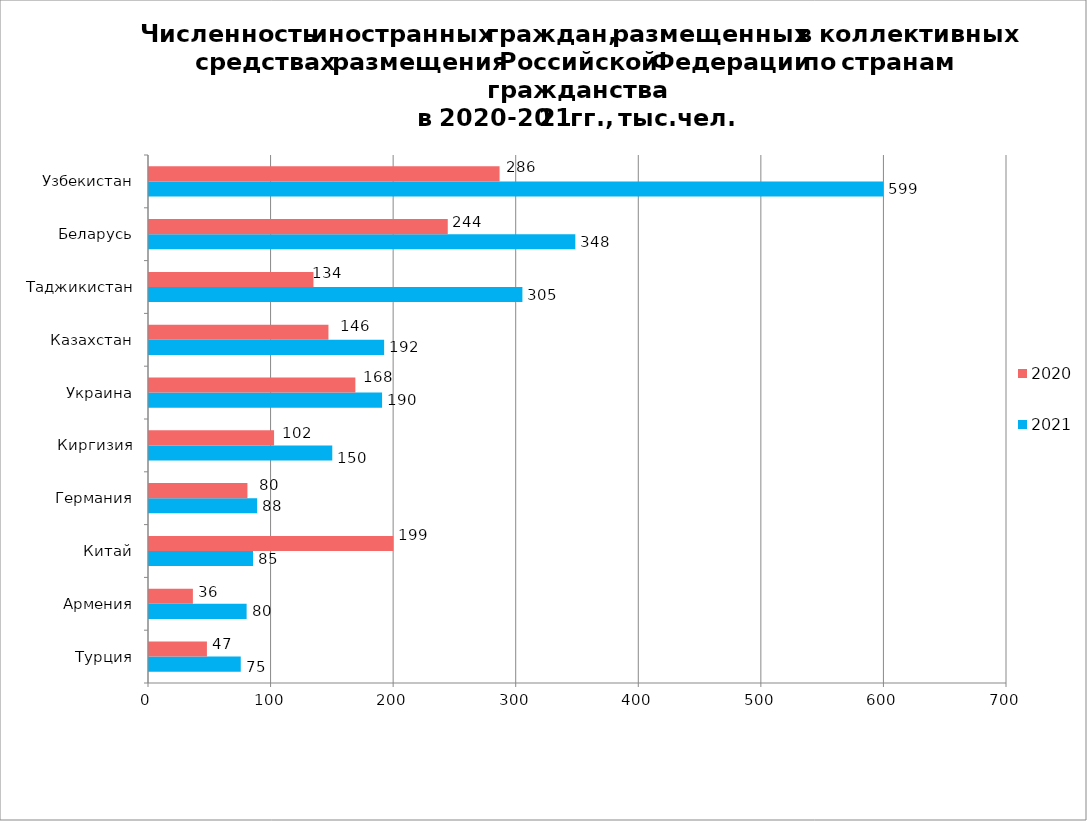
| Category | 2021 | 2020 |
|---|---|---|
| Турция | 74.855 | 47.257 |
| Армения | 79.648 | 35.813 |
| Китай | 84.895 | 199.35 |
| Германия | 88.231 | 80.311 |
| Киргизия | 149.528 | 102.031 |
| Украина | 190.153 | 168.37 |
| Казахстан | 191.835 | 146.401 |
| Таджикистан | 304.641 | 134.166 |
| Беларусь | 347.819 | 243.747 |
| Узбекистан | 598.88 | 286.012 |